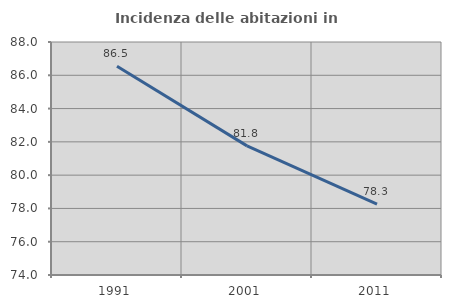
| Category | Incidenza delle abitazioni in proprietà  |
|---|---|
| 1991.0 | 86.543 |
| 2001.0 | 81.758 |
| 2011.0 | 78.255 |